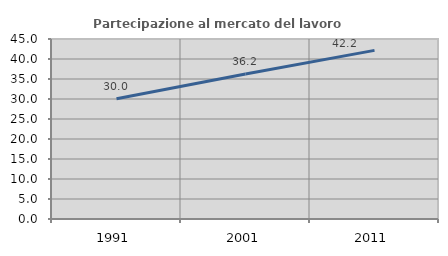
| Category | Partecipazione al mercato del lavoro  femminile |
|---|---|
| 1991.0 | 30.04 |
| 2001.0 | 36.245 |
| 2011.0 | 42.152 |